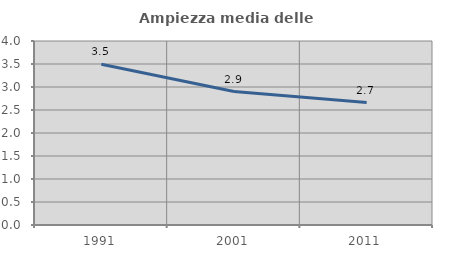
| Category | Ampiezza media delle famiglie |
|---|---|
| 1991.0 | 3.496 |
| 2001.0 | 2.902 |
| 2011.0 | 2.663 |